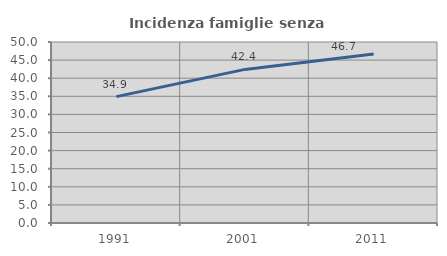
| Category | Incidenza famiglie senza nuclei |
|---|---|
| 1991.0 | 34.903 |
| 2001.0 | 42.434 |
| 2011.0 | 46.711 |